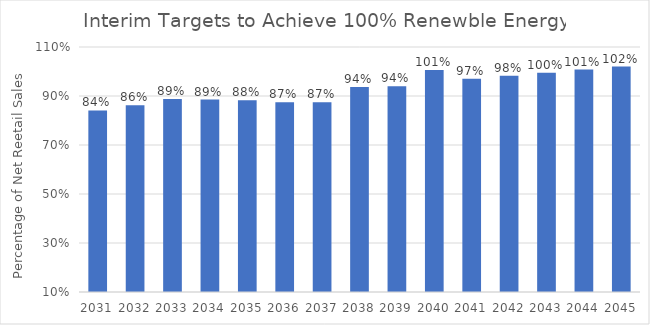
| Category | Percentage Clean Energy |
|---|---|
| 2031.0 | 0.841 |
| 2032.0 | 0.862 |
| 2033.0 | 0.888 |
| 2034.0 | 0.885 |
| 2035.0 | 0.883 |
| 2036.0 | 0.875 |
| 2037.0 | 0.875 |
| 2038.0 | 0.937 |
| 2039.0 | 0.94 |
| 2040.0 | 1.006 |
| 2041.0 | 0.97 |
| 2042.0 | 0.983 |
| 2043.0 | 0.995 |
| 2044.0 | 1.008 |
| 2045.0 | 1.02 |